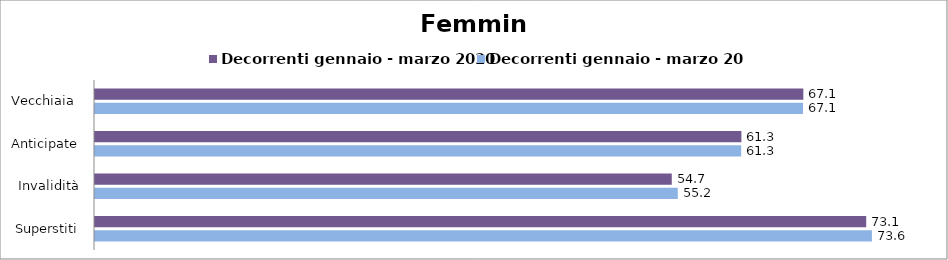
| Category | Decorrenti gennaio - marzo 2020 | Decorrenti gennaio - marzo 2021 |
|---|---|---|
| Vecchiaia  | 67.14 | 67.11 |
| Anticipate | 61.27 | 61.25 |
| Invalidità | 54.67 | 55.24 |
| Superstiti | 73.1 | 73.64 |